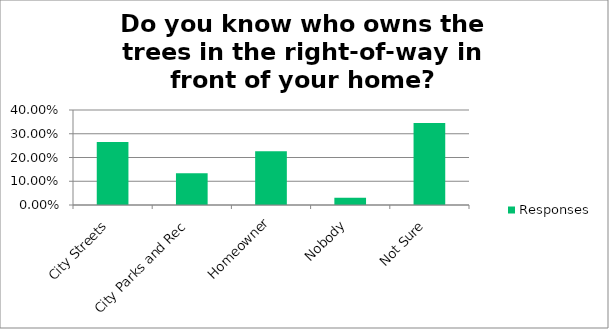
| Category | Responses |
|---|---|
| City Streets | 0.265 |
| City Parks and Rec | 0.133 |
| Homeowner | 0.227 |
| Nobody | 0.03 |
| Not Sure | 0.345 |